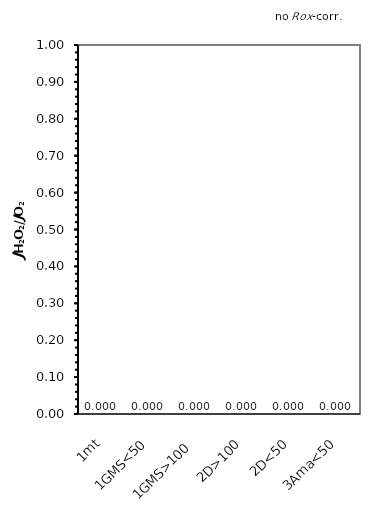
| Category | no ROX-corr. |
|---|---|
| 1mt | 0 |
| 1GMS<50 | 0 |
| 1GMS>100 | 0 |
| 2D>100 | 0 |
| 2D<50 | 0 |
| 3Ama<50 | 0 |